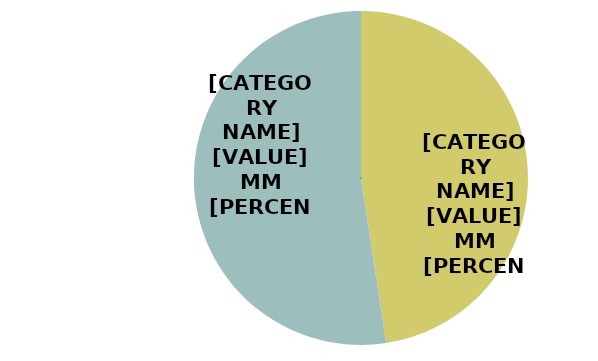
| Category | Series 0 |
|---|---|
| SLICED | 51.82 |
| WHOLE | 57.068 |